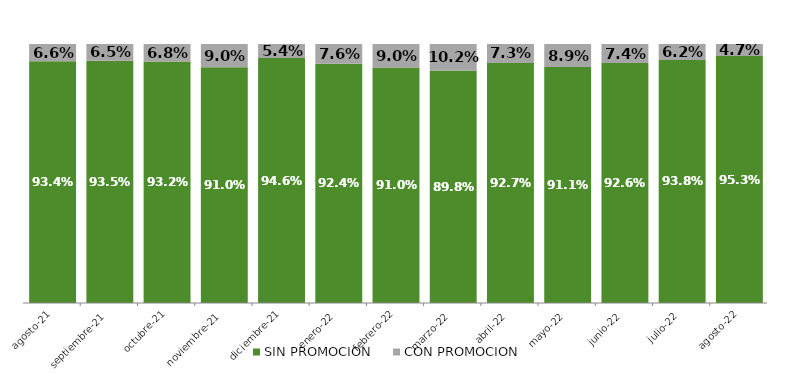
| Category | SIN PROMOCION   | CON PROMOCION   |
|---|---|---|
| 2021-08-01 | 0.934 | 0.066 |
| 2021-09-01 | 0.935 | 0.065 |
| 2021-10-01 | 0.932 | 0.068 |
| 2021-11-01 | 0.91 | 0.09 |
| 2021-12-01 | 0.946 | 0.054 |
| 2022-01-01 | 0.924 | 0.076 |
| 2022-02-01 | 0.91 | 0.09 |
| 2022-03-01 | 0.898 | 0.102 |
| 2022-04-01 | 0.927 | 0.073 |
| 2022-05-01 | 0.911 | 0.089 |
| 2022-06-01 | 0.926 | 0.074 |
| 2022-07-01 | 0.938 | 0.062 |
| 2022-08-01 | 0.953 | 0.047 |